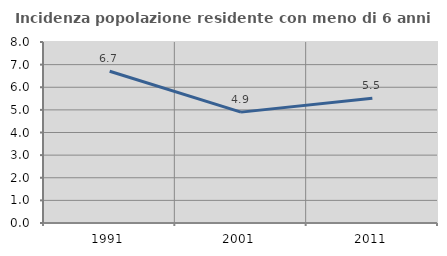
| Category | Incidenza popolazione residente con meno di 6 anni |
|---|---|
| 1991.0 | 6.706 |
| 2001.0 | 4.9 |
| 2011.0 | 5.511 |